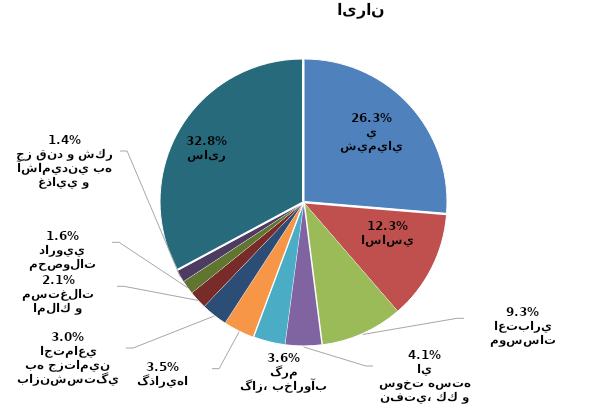
| Category | درصد از كل |
|---|---|
| محصولات شيميايي | 0.263 |
| فلزات اساسي | 0.123 |
| بانكها و موسسات اعتباري | 0.093 |
| فراورده هاي نفتي، كك و سوخت هسته اي | 0.041 |
| عرضه برق، گاز، بخاروآب گرم | 0.036 |
| سرمايه گذاريها | 0.035 |
| بيمه وصندوق بازنشستگي به جزتامين اجتماعي | 0.03 |
| انبوه سازي، املاك و مستغلات | 0.021 |
| مواد و محصولات دارويي | 0.016 |
| محصولات غذايي و آشاميدني به جز قند و شكر | 0.014 |
| سایر | 0.328 |